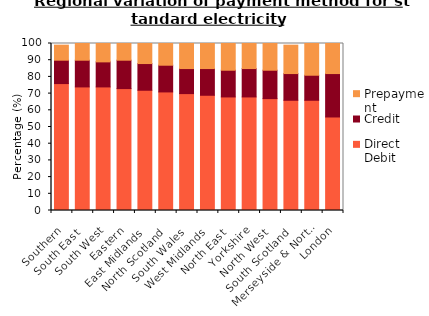
| Category | Direct Debit | Credit | Prepayment |
|---|---|---|---|
| Southern | 76 | 14 | 9 |
| South East | 74 | 16 | 10 |
| South West | 74 | 15 | 11 |
| Eastern | 73 | 17 | 10 |
| East Midlands | 72 | 16 | 12 |
| North Scotland | 71 | 16 | 14 |
| South Wales | 70 | 15 | 16 |
| West Midlands | 69 | 16 | 15 |
| North East | 68 | 16 | 16 |
| Yorkshire | 68 | 17 | 15 |
| North West | 67 | 17 | 16 |
| South Scotland | 66 | 16 | 17 |
| Merseyside & North Wales | 66 | 15 | 19 |
| London | 56 | 26 | 19 |